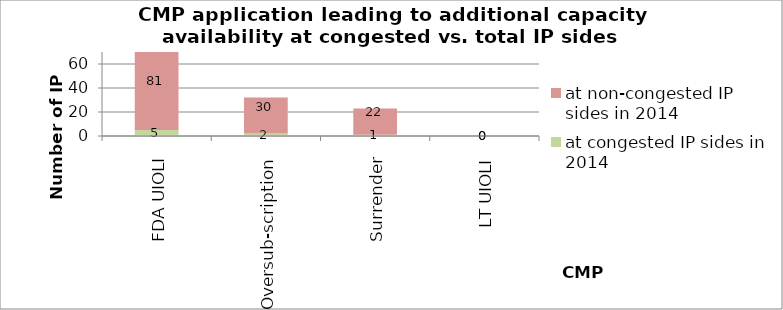
| Category | at congested IP sides in 2014 | at non-congested IP sides in 2014 |
|---|---|---|
| FDA UIOLI | 5 | 81 |
| Oversub-scription | 2 | 30 |
| Surrender | 1 | 22 |
| LT UIOLI | 0 | 0 |